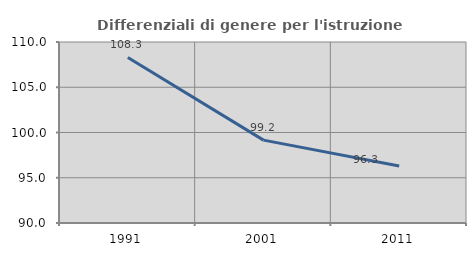
| Category | Differenziali di genere per l'istruzione superiore |
|---|---|
| 1991.0 | 108.292 |
| 2001.0 | 99.159 |
| 2011.0 | 96.288 |